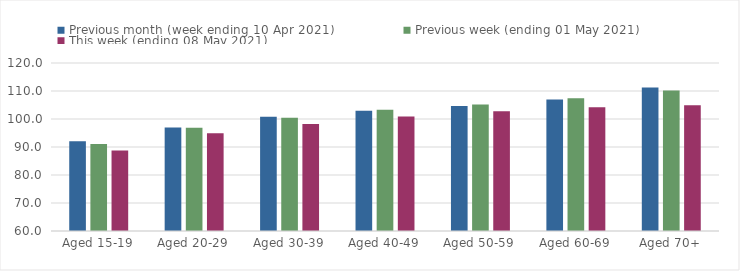
| Category | Previous month (week ending 10 Apr 2021) | Previous week (ending 01 May 2021) | This week (ending 08 May 2021) |
|---|---|---|---|
| Aged 15-19 | 92.06 | 91.09 | 88.77 |
| Aged 20-29 | 96.97 | 96.89 | 94.87 |
| Aged 30-39 | 100.8 | 100.47 | 98.25 |
| Aged 40-49 | 102.93 | 103.27 | 100.86 |
| Aged 50-59 | 104.66 | 105.19 | 102.76 |
| Aged 60-69 | 107 | 107.42 | 104.21 |
| Aged 70+ | 111.27 | 110.18 | 104.91 |